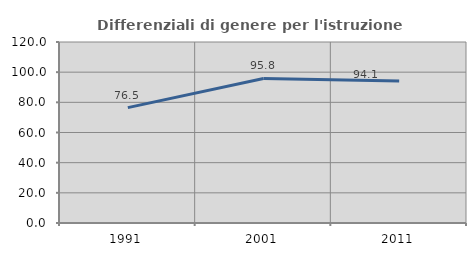
| Category | Differenziali di genere per l'istruzione superiore |
|---|---|
| 1991.0 | 76.485 |
| 2001.0 | 95.822 |
| 2011.0 | 94.083 |